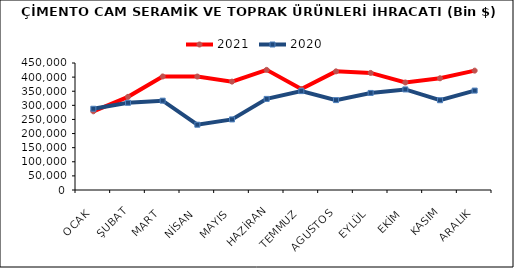
| Category | 2021 | 2020 |
|---|---|---|
| OCAK | 278859.377 | 287885.924 |
| ŞUBAT | 330068.636 | 309016.504 |
| MART | 402262.211 | 316472.831 |
| NİSAN | 401955.995 | 231352.509 |
| MAYIS | 384031.62 | 250091.895 |
| HAZİRAN | 425662.762 | 322827.067 |
| TEMMUZ | 357619.631 | 350447.898 |
| AGUSTOS | 420393.441 | 318562.369 |
| EYLÜL | 414838.569 | 343965.491 |
| EKİM | 380906.946 | 356368.769 |
| KASIM | 395853.355 | 318070.368 |
| ARALIK | 422928.184 | 352265.439 |